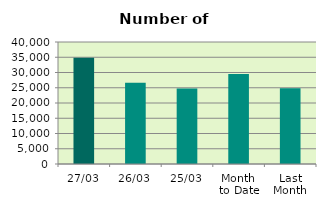
| Category | Series 0 |
|---|---|
| 27/03 | 34842 |
| 26/03 | 26638 |
| 25/03 | 24738 |
| Month 
to Date | 29522.316 |
| Last
Month | 24872.2 |